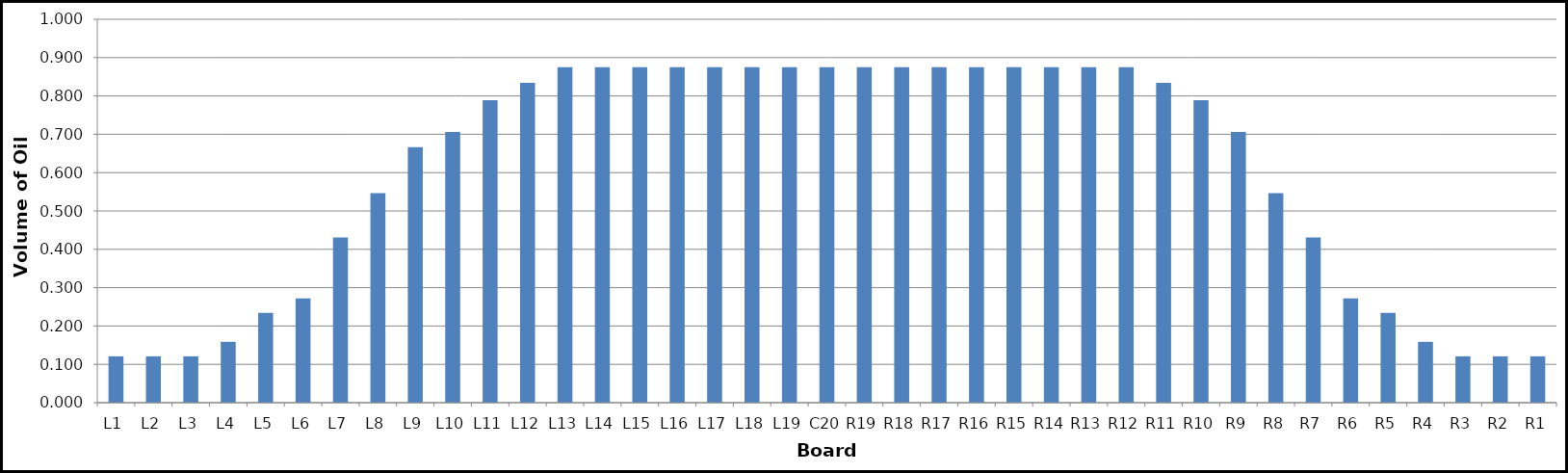
| Category | Series 0 |
|---|---|
| L1 | 0.121 |
| L2 | 0.121 |
| L3 | 0.121 |
| L4 | 0.159 |
| L5 | 0.234 |
| L6 | 0.272 |
| L7 | 0.431 |
| L8 | 0.546 |
| L9 | 0.666 |
| L10 | 0.706 |
| L11 | 0.789 |
| L12 | 0.834 |
| L13 | 0.875 |
| L14 | 0.875 |
| L15 | 0.875 |
| L16 | 0.875 |
| L17 | 0.875 |
| L18 | 0.875 |
| L19 | 0.875 |
| C20 | 0.875 |
| R19 | 0.875 |
| R18 | 0.875 |
| R17 | 0.875 |
| R16 | 0.875 |
| R15 | 0.875 |
| R14 | 0.875 |
| R13 | 0.875 |
| R12 | 0.875 |
| R11 | 0.834 |
| R10 | 0.789 |
| R9 | 0.706 |
| R8 | 0.546 |
| R7 | 0.431 |
| R6 | 0.272 |
| R5 | 0.234 |
| R4 | 0.159 |
| R3 | 0.121 |
| R2 | 0.121 |
| R1 | 0.121 |